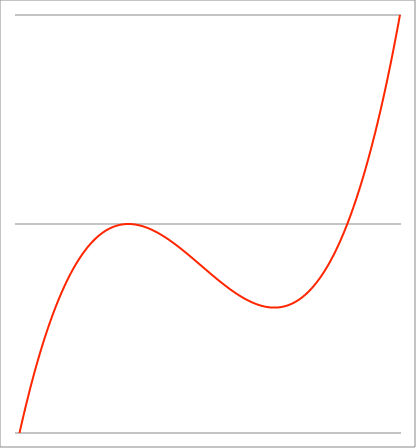
| Category | Series 1 |
|---|---|
| -3.54 | -1.077 |
| -3.537355 | -1.072 |
| -3.53471 | -1.068 |
| -3.532065000000001 | -1.064 |
| -3.529420000000001 | -1.059 |
| -3.526775000000001 | -1.055 |
| -3.524130000000001 | -1.051 |
| -3.521485000000002 | -1.047 |
| -3.518840000000002 | -1.042 |
| -3.516195000000002 | -1.038 |
| -3.513550000000002 | -1.034 |
| -3.510905000000002 | -1.03 |
| -3.508260000000003 | -1.026 |
| -3.505615000000003 | -1.021 |
| -3.502970000000003 | -1.017 |
| -3.500325000000003 | -1.013 |
| -3.497680000000003 | -1.009 |
| -3.495035000000004 | -1.005 |
| -3.492390000000004 | -1.001 |
| -3.489745000000004 | -0.996 |
| -3.487100000000004 | -0.992 |
| -3.484455000000004 | -0.988 |
| -3.481810000000005 | -0.984 |
| -3.479165000000005 | -0.98 |
| -3.476520000000005 | -0.976 |
| -3.473875000000005 | -0.972 |
| -3.471230000000006 | -0.968 |
| -3.468585000000006 | -0.964 |
| -3.465940000000006 | -0.96 |
| -3.463295000000006 | -0.956 |
| -3.460650000000006 | -0.952 |
| -3.458005000000007 | -0.948 |
| -3.455360000000007 | -0.944 |
| -3.452715000000007 | -0.94 |
| -3.450070000000007 | -0.936 |
| -3.447425000000007 | -0.932 |
| -3.444780000000008 | -0.928 |
| -3.442135000000008 | -0.924 |
| -3.439490000000008 | -0.92 |
| -3.436845000000008 | -0.916 |
| -3.434200000000009 | -0.912 |
| -3.431555000000009 | -0.908 |
| -3.428910000000009 | -0.904 |
| -3.426265000000009 | -0.9 |
| -3.423620000000009 | -0.897 |
| -3.42097500000001 | -0.893 |
| -3.41833000000001 | -0.889 |
| -3.41568500000001 | -0.885 |
| -3.41304000000001 | -0.881 |
| -3.41039500000001 | -0.877 |
| -3.407750000000011 | -0.874 |
| -3.405105000000011 | -0.87 |
| -3.402460000000011 | -0.866 |
| -3.399815000000011 | -0.862 |
| -3.397170000000011 | -0.858 |
| -3.394525000000012 | -0.855 |
| -3.391880000000012 | -0.851 |
| -3.389235000000012 | -0.847 |
| -3.386590000000012 | -0.843 |
| -3.383945000000013 | -0.84 |
| -3.381300000000013 | -0.836 |
| -3.378655000000013 | -0.832 |
| -3.376010000000013 | -0.829 |
| -3.373365000000013 | -0.825 |
| -3.370720000000014 | -0.821 |
| -3.368075000000014 | -0.818 |
| -3.365430000000014 | -0.814 |
| -3.362785000000014 | -0.81 |
| -3.360140000000015 | -0.807 |
| -3.357495000000015 | -0.803 |
| -3.354850000000015 | -0.799 |
| -3.352205000000015 | -0.796 |
| -3.349560000000015 | -0.792 |
| -3.346915000000016 | -0.789 |
| -3.344270000000016 | -0.785 |
| -3.341625000000016 | -0.781 |
| -3.338980000000016 | -0.778 |
| -3.336335000000016 | -0.774 |
| -3.333690000000017 | -0.771 |
| -3.331045000000017 | -0.767 |
| -3.328400000000017 | -0.764 |
| -3.325755000000017 | -0.76 |
| -3.323110000000017 | -0.757 |
| -3.320465000000018 | -0.753 |
| -3.317820000000018 | -0.75 |
| -3.315175000000018 | -0.746 |
| -3.312530000000018 | -0.743 |
| -3.309885000000019 | -0.739 |
| -3.307240000000019 | -0.736 |
| -3.304595000000019 | -0.733 |
| -3.301950000000019 | -0.729 |
| -3.299305000000019 | -0.726 |
| -3.29666000000002 | -0.722 |
| -3.29401500000002 | -0.719 |
| -3.29137000000002 | -0.716 |
| -3.28872500000002 | -0.712 |
| -3.286080000000021 | -0.709 |
| -3.283435000000021 | -0.706 |
| -3.280790000000021 | -0.702 |
| -3.278145000000021 | -0.699 |
| -3.275500000000021 | -0.696 |
| -3.272855000000022 | -0.692 |
| -3.270210000000022 | -0.689 |
| -3.267565000000022 | -0.686 |
| -3.264920000000022 | -0.682 |
| -3.262275000000022 | -0.679 |
| -3.259630000000023 | -0.676 |
| -3.256985000000023 | -0.673 |
| -3.254340000000023 | -0.669 |
| -3.251695000000023 | -0.666 |
| -3.249050000000024 | -0.663 |
| -3.246405000000024 | -0.66 |
| -3.243760000000024 | -0.656 |
| -3.241115000000024 | -0.653 |
| -3.238470000000024 | -0.65 |
| -3.235825000000025 | -0.647 |
| -3.233180000000025 | -0.644 |
| -3.230535000000025 | -0.641 |
| -3.227890000000025 | -0.637 |
| -3.225245000000025 | -0.634 |
| -3.222600000000026 | -0.631 |
| -3.219955000000026 | -0.628 |
| -3.217310000000026 | -0.625 |
| -3.214665000000026 | -0.622 |
| -3.212020000000027 | -0.619 |
| -3.209375000000027 | -0.616 |
| -3.206730000000027 | -0.613 |
| -3.204085000000027 | -0.61 |
| -3.201440000000027 | -0.606 |
| -3.198795000000028 | -0.603 |
| -3.196150000000028 | -0.6 |
| -3.193505000000028 | -0.597 |
| -3.190860000000028 | -0.594 |
| -3.188215000000028 | -0.591 |
| -3.185570000000029 | -0.588 |
| -3.182925000000029 | -0.585 |
| -3.18028000000003 | -0.582 |
| -3.177635000000029 | -0.579 |
| -3.174990000000029 | -0.576 |
| -3.17234500000003 | -0.573 |
| -3.16970000000003 | -0.57 |
| -3.16705500000003 | -0.568 |
| -3.16441000000003 | -0.565 |
| -3.161765000000031 | -0.562 |
| -3.159120000000031 | -0.559 |
| -3.156475000000031 | -0.556 |
| -3.153830000000031 | -0.553 |
| -3.151185000000031 | -0.55 |
| -3.148540000000032 | -0.547 |
| -3.145895000000032 | -0.544 |
| -3.143250000000032 | -0.542 |
| -3.140605000000032 | -0.539 |
| -3.137960000000032 | -0.536 |
| -3.135315000000033 | -0.533 |
| -3.132670000000033 | -0.53 |
| -3.130025000000033 | -0.527 |
| -3.127380000000033 | -0.525 |
| -3.124735000000033 | -0.522 |
| -3.122090000000034 | -0.519 |
| -3.119445000000034 | -0.516 |
| -3.116800000000034 | -0.513 |
| -3.114155000000034 | -0.511 |
| -3.111510000000035 | -0.508 |
| -3.108865000000035 | -0.505 |
| -3.106220000000035 | -0.502 |
| -3.103575000000035 | -0.5 |
| -3.100930000000035 | -0.497 |
| -3.098285000000036 | -0.494 |
| -3.095640000000036 | -0.492 |
| -3.092995000000036 | -0.489 |
| -3.090350000000036 | -0.486 |
| -3.087705000000036 | -0.484 |
| -3.085060000000037 | -0.481 |
| -3.082415000000037 | -0.478 |
| -3.079770000000037 | -0.476 |
| -3.077125000000037 | -0.473 |
| -3.074480000000038 | -0.47 |
| -3.071835000000038 | -0.468 |
| -3.069190000000038 | -0.465 |
| -3.066545000000038 | -0.463 |
| -3.063900000000038 | -0.46 |
| -3.061255000000039 | -0.457 |
| -3.058610000000039 | -0.455 |
| -3.055965000000039 | -0.452 |
| -3.05332000000004 | -0.45 |
| -3.05067500000004 | -0.447 |
| -3.04803000000004 | -0.445 |
| -3.04538500000004 | -0.442 |
| -3.04274000000004 | -0.44 |
| -3.04009500000004 | -0.437 |
| -3.037450000000041 | -0.435 |
| -3.034805000000041 | -0.432 |
| -3.032160000000041 | -0.43 |
| -3.029515000000041 | -0.427 |
| -3.026870000000041 | -0.425 |
| -3.024225000000042 | -0.422 |
| -3.021580000000042 | -0.42 |
| -3.018935000000042 | -0.417 |
| -3.016290000000042 | -0.415 |
| -3.013645000000043 | -0.412 |
| -3.011000000000043 | -0.41 |
| -3.008355000000043 | -0.408 |
| -3.005710000000043 | -0.405 |
| -3.003065000000043 | -0.403 |
| -3.000420000000044 | -0.4 |
| -2.997775000000044 | -0.398 |
| -2.995130000000044 | -0.396 |
| -2.992485000000044 | -0.393 |
| -2.989840000000044 | -0.391 |
| -2.987195000000045 | -0.389 |
| -2.984550000000045 | -0.386 |
| -2.981905000000045 | -0.384 |
| -2.979260000000045 | -0.382 |
| -2.976615000000045 | -0.379 |
| -2.973970000000046 | -0.377 |
| -2.971325000000046 | -0.375 |
| -2.968680000000046 | -0.372 |
| -2.966035000000046 | -0.37 |
| -2.963390000000046 | -0.368 |
| -2.960745000000047 | -0.366 |
| -2.958100000000047 | -0.363 |
| -2.955455000000047 | -0.361 |
| -2.952810000000047 | -0.359 |
| -2.950165000000048 | -0.357 |
| -2.947520000000048 | -0.354 |
| -2.944875000000048 | -0.352 |
| -2.942230000000048 | -0.35 |
| -2.939585000000048 | -0.348 |
| -2.936940000000049 | -0.346 |
| -2.934295000000049 | -0.343 |
| -2.931650000000049 | -0.341 |
| -2.929005000000049 | -0.339 |
| -2.92636000000005 | -0.337 |
| -2.92371500000005 | -0.335 |
| -2.92107000000005 | -0.333 |
| -2.91842500000005 | -0.331 |
| -2.91578000000005 | -0.328 |
| -2.913135000000051 | -0.326 |
| -2.910490000000051 | -0.324 |
| -2.907845000000051 | -0.322 |
| -2.905200000000051 | -0.32 |
| -2.902555000000051 | -0.318 |
| -2.899910000000052 | -0.316 |
| -2.897265000000052 | -0.314 |
| -2.894620000000052 | -0.312 |
| -2.891975000000052 | -0.31 |
| -2.889330000000052 | -0.308 |
| -2.886685000000053 | -0.306 |
| -2.884040000000053 | -0.304 |
| -2.881395000000053 | -0.302 |
| -2.878750000000053 | -0.3 |
| -2.876105000000054 | -0.298 |
| -2.873460000000054 | -0.296 |
| -2.870815000000054 | -0.294 |
| -2.868170000000054 | -0.292 |
| -2.865525000000054 | -0.29 |
| -2.862880000000055 | -0.288 |
| -2.860235000000055 | -0.286 |
| -2.857590000000055 | -0.284 |
| -2.854945000000055 | -0.282 |
| -2.852300000000056 | -0.28 |
| -2.849655000000056 | -0.278 |
| -2.847010000000056 | -0.276 |
| -2.844365000000056 | -0.274 |
| -2.841720000000056 | -0.272 |
| -2.839075000000057 | -0.27 |
| -2.836430000000057 | -0.268 |
| -2.833785000000057 | -0.267 |
| -2.831140000000057 | -0.265 |
| -2.828495000000057 | -0.263 |
| -2.825850000000058 | -0.261 |
| -2.823205000000058 | -0.259 |
| -2.820560000000058 | -0.257 |
| -2.817915000000058 | -0.255 |
| -2.815270000000059 | -0.254 |
| -2.812625000000059 | -0.252 |
| -2.809980000000059 | -0.25 |
| -2.80733500000006 | -0.248 |
| -2.804690000000059 | -0.246 |
| -2.80204500000006 | -0.245 |
| -2.79940000000006 | -0.243 |
| -2.79675500000006 | -0.241 |
| -2.79411000000006 | -0.239 |
| -2.79146500000006 | -0.238 |
| -2.788820000000061 | -0.236 |
| -2.786175000000061 | -0.234 |
| -2.783530000000061 | -0.232 |
| -2.780885000000061 | -0.231 |
| -2.778240000000061 | -0.229 |
| -2.775595000000062 | -0.227 |
| -2.772950000000062 | -0.225 |
| -2.770305000000062 | -0.224 |
| -2.767660000000062 | -0.222 |
| -2.765015000000063 | -0.22 |
| -2.762370000000063 | -0.219 |
| -2.759725000000063 | -0.217 |
| -2.757080000000063 | -0.215 |
| -2.754435000000063 | -0.214 |
| -2.751790000000064 | -0.212 |
| -2.749145000000064 | -0.21 |
| -2.746500000000064 | -0.209 |
| -2.743855000000064 | -0.207 |
| -2.741210000000064 | -0.206 |
| -2.738565000000065 | -0.204 |
| -2.735920000000065 | -0.202 |
| -2.733275000000065 | -0.201 |
| -2.730630000000065 | -0.199 |
| -2.727985000000066 | -0.198 |
| -2.725340000000066 | -0.196 |
| -2.722695000000066 | -0.194 |
| -2.720050000000066 | -0.193 |
| -2.717405000000066 | -0.191 |
| -2.714760000000067 | -0.19 |
| -2.712115000000067 | -0.188 |
| -2.709470000000067 | -0.187 |
| -2.706825000000067 | -0.185 |
| -2.704180000000067 | -0.184 |
| -2.701535000000068 | -0.182 |
| -2.698890000000068 | -0.181 |
| -2.696245000000068 | -0.179 |
| -2.693600000000068 | -0.178 |
| -2.690955000000068 | -0.176 |
| -2.688310000000069 | -0.175 |
| -2.685665000000069 | -0.173 |
| -2.68302000000007 | -0.172 |
| -2.680375000000069 | -0.17 |
| -2.67773000000007 | -0.169 |
| -2.67508500000007 | -0.167 |
| -2.67244000000007 | -0.166 |
| -2.66979500000007 | -0.165 |
| -2.66715000000007 | -0.163 |
| -2.664505000000071 | -0.162 |
| -2.661860000000071 | -0.16 |
| -2.659215000000071 | -0.159 |
| -2.656570000000071 | -0.158 |
| -2.653925000000071 | -0.156 |
| -2.651280000000072 | -0.155 |
| -2.648635000000072 | -0.154 |
| -2.645990000000072 | -0.152 |
| -2.643345000000072 | -0.151 |
| -2.640700000000072 | -0.149 |
| -2.638055000000073 | -0.148 |
| -2.635410000000073 | -0.147 |
| -2.632765000000073 | -0.145 |
| -2.630120000000073 | -0.144 |
| -2.627475000000074 | -0.143 |
| -2.624830000000074 | -0.142 |
| -2.622185000000074 | -0.14 |
| -2.619540000000074 | -0.139 |
| -2.616895000000074 | -0.138 |
| -2.614250000000075 | -0.136 |
| -2.611605000000075 | -0.135 |
| -2.608960000000075 | -0.134 |
| -2.606315000000075 | -0.133 |
| -2.603670000000076 | -0.131 |
| -2.601025000000076 | -0.13 |
| -2.598380000000076 | -0.129 |
| -2.595735000000076 | -0.128 |
| -2.593090000000076 | -0.126 |
| -2.590445000000077 | -0.125 |
| -2.587800000000077 | -0.124 |
| -2.585155000000077 | -0.123 |
| -2.582510000000077 | -0.122 |
| -2.579865000000078 | -0.12 |
| -2.577220000000078 | -0.119 |
| -2.574575000000078 | -0.118 |
| -2.571930000000078 | -0.117 |
| -2.569285000000078 | -0.116 |
| -2.566640000000079 | -0.115 |
| -2.563995000000079 | -0.113 |
| -2.56135000000008 | -0.112 |
| -2.558705000000079 | -0.111 |
| -2.556060000000079 | -0.11 |
| -2.55341500000008 | -0.109 |
| -2.55077000000008 | -0.108 |
| -2.54812500000008 | -0.107 |
| -2.54548000000008 | -0.105 |
| -2.542835000000081 | -0.104 |
| -2.540190000000081 | -0.103 |
| -2.537545000000081 | -0.102 |
| -2.534900000000081 | -0.101 |
| -2.532255000000081 | -0.1 |
| -2.529610000000082 | -0.099 |
| -2.526965000000082 | -0.098 |
| -2.524320000000082 | -0.097 |
| -2.521675000000082 | -0.096 |
| -2.519030000000082 | -0.095 |
| -2.516385000000083 | -0.094 |
| -2.513740000000083 | -0.093 |
| -2.511095000000083 | -0.092 |
| -2.508450000000083 | -0.091 |
| -2.505805000000084 | -0.09 |
| -2.503160000000084 | -0.089 |
| -2.500515000000084 | -0.088 |
| -2.497870000000084 | -0.087 |
| -2.495225000000084 | -0.086 |
| -2.492580000000085 | -0.085 |
| -2.489935000000085 | -0.084 |
| -2.487290000000085 | -0.083 |
| -2.484645000000085 | -0.082 |
| -2.482000000000085 | -0.081 |
| -2.479355000000086 | -0.08 |
| -2.476710000000086 | -0.079 |
| -2.474065000000086 | -0.078 |
| -2.471420000000086 | -0.077 |
| -2.468775000000087 | -0.076 |
| -2.466130000000087 | -0.075 |
| -2.463485000000087 | -0.074 |
| -2.460840000000087 | -0.073 |
| -2.458195000000087 | -0.073 |
| -2.455550000000088 | -0.072 |
| -2.452905000000088 | -0.071 |
| -2.450260000000088 | -0.07 |
| -2.447615000000088 | -0.069 |
| -2.444970000000088 | -0.068 |
| -2.442325000000089 | -0.067 |
| -2.439680000000089 | -0.066 |
| -2.437035000000089 | -0.066 |
| -2.434390000000089 | -0.065 |
| -2.43174500000009 | -0.064 |
| -2.42910000000009 | -0.063 |
| -2.42645500000009 | -0.062 |
| -2.42381000000009 | -0.061 |
| -2.42116500000009 | -0.061 |
| -2.418520000000091 | -0.06 |
| -2.415875000000091 | -0.059 |
| -2.413230000000091 | -0.058 |
| -2.410585000000091 | -0.057 |
| -2.407940000000091 | -0.057 |
| -2.405295000000092 | -0.056 |
| -2.402650000000092 | -0.055 |
| -2.400005000000092 | -0.054 |
| -2.397360000000092 | -0.054 |
| -2.394715000000092 | -0.053 |
| -2.392070000000093 | -0.052 |
| -2.389425000000093 | -0.051 |
| -2.386780000000093 | -0.051 |
| -2.384135000000093 | -0.05 |
| -2.381490000000094 | -0.049 |
| -2.378845000000094 | -0.048 |
| -2.376200000000094 | -0.048 |
| -2.373555000000094 | -0.047 |
| -2.370910000000094 | -0.046 |
| -2.368265000000095 | -0.046 |
| -2.365620000000095 | -0.045 |
| -2.362975000000095 | -0.044 |
| -2.360330000000095 | -0.044 |
| -2.357685000000095 | -0.043 |
| -2.355040000000096 | -0.042 |
| -2.352395000000096 | -0.042 |
| -2.349750000000096 | -0.041 |
| -2.347105000000096 | -0.04 |
| -2.344460000000097 | -0.04 |
| -2.341815000000097 | -0.039 |
| -2.339170000000097 | -0.038 |
| -2.336525000000097 | -0.038 |
| -2.333880000000097 | -0.037 |
| -2.331235000000098 | -0.037 |
| -2.328590000000098 | -0.036 |
| -2.325945000000098 | -0.035 |
| -2.323300000000098 | -0.035 |
| -2.320655000000098 | -0.034 |
| -2.318010000000099 | -0.034 |
| -2.315365000000099 | -0.033 |
| -2.312720000000099 | -0.032 |
| -2.310075000000099 | -0.032 |
| -2.3074300000001 | -0.031 |
| -2.3047850000001 | -0.031 |
| -2.3021400000001 | -0.03 |
| -2.2994950000001 | -0.03 |
| -2.2968500000001 | -0.029 |
| -2.294205000000101 | -0.029 |
| -2.291560000000101 | -0.028 |
| -2.288915000000101 | -0.027 |
| -2.286270000000101 | -0.027 |
| -2.283625000000101 | -0.026 |
| -2.280980000000102 | -0.026 |
| -2.278335000000102 | -0.025 |
| -2.275690000000102 | -0.025 |
| -2.273045000000102 | -0.024 |
| -2.270400000000103 | -0.024 |
| -2.267755000000103 | -0.023 |
| -2.265110000000103 | -0.023 |
| -2.262465000000103 | -0.022 |
| -2.259820000000103 | -0.022 |
| -2.257175000000104 | -0.022 |
| -2.254530000000104 | -0.021 |
| -2.251885000000104 | -0.021 |
| -2.249240000000104 | -0.02 |
| -2.246595000000104 | -0.02 |
| -2.243950000000105 | -0.019 |
| -2.241305000000105 | -0.019 |
| -2.238660000000105 | -0.018 |
| -2.236015000000105 | -0.018 |
| -2.233370000000106 | -0.018 |
| -2.230725000000106 | -0.017 |
| -2.228080000000106 | -0.017 |
| -2.225435000000106 | -0.016 |
| -2.222790000000106 | -0.016 |
| -2.220145000000107 | -0.016 |
| -2.217500000000107 | -0.015 |
| -2.214855000000107 | -0.015 |
| -2.212210000000107 | -0.014 |
| -2.209565000000107 | -0.014 |
| -2.206920000000108 | -0.014 |
| -2.204275000000108 | -0.013 |
| -2.201630000000108 | -0.013 |
| -2.198985000000108 | -0.013 |
| -2.196340000000109 | -0.012 |
| -2.193695000000109 | -0.012 |
| -2.191050000000109 | -0.012 |
| -2.188405000000109 | -0.011 |
| -2.185760000000109 | -0.011 |
| -2.18311500000011 | -0.011 |
| -2.18047000000011 | -0.01 |
| -2.17782500000011 | -0.01 |
| -2.17518000000011 | -0.01 |
| -2.17253500000011 | -0.009 |
| -2.169890000000111 | -0.009 |
| -2.167245000000111 | -0.009 |
| -2.164600000000111 | -0.009 |
| -2.161955000000111 | -0.008 |
| -2.159310000000112 | -0.008 |
| -2.156665000000112 | -0.008 |
| -2.154020000000112 | -0.007 |
| -2.151375000000112 | -0.007 |
| -2.148730000000112 | -0.007 |
| -2.146085000000113 | -0.007 |
| -2.143440000000113 | -0.006 |
| -2.140795000000113 | -0.006 |
| -2.138150000000113 | -0.006 |
| -2.135505000000113 | -0.006 |
| -2.132860000000114 | -0.006 |
| -2.130215000000114 | -0.005 |
| -2.127570000000114 | -0.005 |
| -2.124925000000114 | -0.005 |
| -2.122280000000115 | -0.005 |
| -2.119635000000115 | -0.004 |
| -2.116990000000115 | -0.004 |
| -2.114345000000115 | -0.004 |
| -2.111700000000115 | -0.004 |
| -2.109055000000116 | -0.004 |
| -2.106410000000116 | -0.004 |
| -2.103765000000116 | -0.003 |
| -2.101120000000116 | -0.003 |
| -2.098475000000116 | -0.003 |
| -2.095830000000117 | -0.003 |
| -2.093185000000117 | -0.003 |
| -2.090540000000117 | -0.003 |
| -2.087895000000117 | -0.002 |
| -2.085250000000117 | -0.002 |
| -2.082605000000118 | -0.002 |
| -2.079960000000118 | -0.002 |
| -2.077315000000118 | -0.002 |
| -2.074670000000118 | -0.002 |
| -2.072025000000119 | -0.002 |
| -2.069380000000119 | -0.001 |
| -2.066735000000119 | -0.001 |
| -2.06409000000012 | -0.001 |
| -2.061445000000119 | -0.001 |
| -2.05880000000012 | -0.001 |
| -2.05615500000012 | -0.001 |
| -2.05351000000012 | -0.001 |
| -2.05086500000012 | -0.001 |
| -2.04822000000012 | -0.001 |
| -2.045575000000121 | -0.001 |
| -2.042930000000121 | -0.001 |
| -2.040285000000121 | 0 |
| -2.037640000000121 | 0 |
| -2.034995000000122 | 0 |
| -2.032350000000122 | 0 |
| -2.029705000000122 | 0 |
| -2.027060000000122 | 0 |
| -2.024415000000122 | 0 |
| -2.021770000000123 | 0 |
| -2.019125000000123 | 0 |
| -2.016480000000123 | 0 |
| -2.013835000000123 | 0 |
| -2.011190000000123 | 0 |
| -2.008545000000124 | 0 |
| -2.005900000000124 | 0 |
| -2.003255000000124 | 0 |
| -2.000610000000124 | 0 |
| -1.997965000000124 | 0 |
| -1.995320000000124 | 0 |
| -1.992675000000124 | 0 |
| -1.990030000000124 | 0 |
| -1.987385000000124 | 0 |
| -1.984740000000124 | 0 |
| -1.982095000000124 | 0 |
| -1.979450000000124 | 0 |
| -1.976805000000124 | 0 |
| -1.974160000000124 | 0 |
| -1.971515000000124 | 0 |
| -1.968870000000124 | 0 |
| -1.966225000000124 | 0 |
| -1.963580000000124 | 0 |
| -1.960935000000124 | 0 |
| -1.958290000000124 | -0.001 |
| -1.955645000000124 | -0.001 |
| -1.953000000000124 | -0.001 |
| -1.950355000000124 | -0.001 |
| -1.947710000000124 | -0.001 |
| -1.945065000000124 | -0.001 |
| -1.942420000000124 | -0.001 |
| -1.939775000000124 | -0.001 |
| -1.937130000000124 | -0.001 |
| -1.934485000000124 | -0.001 |
| -1.931840000000124 | -0.001 |
| -1.929195000000124 | -0.001 |
| -1.926550000000124 | -0.002 |
| -1.923905000000124 | -0.002 |
| -1.921260000000124 | -0.002 |
| -1.918615000000124 | -0.002 |
| -1.915970000000124 | -0.002 |
| -1.913325000000124 | -0.002 |
| -1.910680000000124 | -0.002 |
| -1.908035000000124 | -0.002 |
| -1.905390000000124 | -0.003 |
| -1.902745000000124 | -0.003 |
| -1.900100000000124 | -0.003 |
| -1.897455000000124 | -0.003 |
| -1.894810000000124 | -0.003 |
| -1.892165000000124 | -0.003 |
| -1.889520000000124 | -0.004 |
| -1.886875000000124 | -0.004 |
| -1.884230000000124 | -0.004 |
| -1.881585000000124 | -0.004 |
| -1.878940000000124 | -0.004 |
| -1.876295000000124 | -0.004 |
| -1.873650000000124 | -0.005 |
| -1.871005000000124 | -0.005 |
| -1.868360000000124 | -0.005 |
| -1.865715000000124 | -0.005 |
| -1.863070000000124 | -0.005 |
| -1.860425000000124 | -0.006 |
| -1.857780000000124 | -0.006 |
| -1.855135000000124 | -0.006 |
| -1.852490000000124 | -0.006 |
| -1.849845000000124 | -0.006 |
| -1.847200000000124 | -0.007 |
| -1.844555000000124 | -0.007 |
| -1.841910000000124 | -0.007 |
| -1.839265000000124 | -0.007 |
| -1.836620000000124 | -0.008 |
| -1.833975000000124 | -0.008 |
| -1.831330000000124 | -0.008 |
| -1.828685000000124 | -0.008 |
| -1.826040000000124 | -0.009 |
| -1.823395000000124 | -0.009 |
| -1.820750000000124 | -0.009 |
| -1.818105000000124 | -0.009 |
| -1.815460000000124 | -0.01 |
| -1.812815000000124 | -0.01 |
| -1.810170000000124 | -0.01 |
| -1.807525000000124 | -0.01 |
| -1.804880000000124 | -0.011 |
| -1.802235000000124 | -0.011 |
| -1.799590000000124 | -0.011 |
| -1.796945000000124 | -0.012 |
| -1.794300000000124 | -0.012 |
| -1.791655000000124 | -0.012 |
| -1.789010000000124 | -0.012 |
| -1.786365000000124 | -0.013 |
| -1.783720000000124 | -0.013 |
| -1.781075000000124 | -0.013 |
| -1.778430000000124 | -0.014 |
| -1.775785000000124 | -0.014 |
| -1.773140000000124 | -0.014 |
| -1.770495000000124 | -0.015 |
| -1.767850000000124 | -0.015 |
| -1.765205000000124 | -0.015 |
| -1.762560000000124 | -0.016 |
| -1.759915000000123 | -0.016 |
| -1.757270000000123 | -0.016 |
| -1.754625000000123 | -0.017 |
| -1.751980000000123 | -0.017 |
| -1.749335000000123 | -0.017 |
| -1.746690000000123 | -0.018 |
| -1.744045000000123 | -0.018 |
| -1.741400000000123 | -0.018 |
| -1.738755000000123 | -0.019 |
| -1.736110000000123 | -0.019 |
| -1.733465000000123 | -0.019 |
| -1.730820000000123 | -0.02 |
| -1.728175000000123 | -0.02 |
| -1.725530000000123 | -0.021 |
| -1.722885000000123 | -0.021 |
| -1.720240000000123 | -0.021 |
| -1.717595000000123 | -0.022 |
| -1.714950000000123 | -0.022 |
| -1.712305000000123 | -0.022 |
| -1.709660000000123 | -0.023 |
| -1.707015000000123 | -0.023 |
| -1.704370000000123 | -0.024 |
| -1.701725000000123 | -0.024 |
| -1.699080000000123 | -0.024 |
| -1.696435000000123 | -0.025 |
| -1.693790000000123 | -0.025 |
| -1.691145000000123 | -0.026 |
| -1.688500000000123 | -0.026 |
| -1.685855000000123 | -0.027 |
| -1.683210000000123 | -0.027 |
| -1.680565000000123 | -0.027 |
| -1.677920000000123 | -0.028 |
| -1.675275000000123 | -0.028 |
| -1.672630000000123 | -0.029 |
| -1.669985000000123 | -0.029 |
| -1.667340000000123 | -0.03 |
| -1.664695000000123 | -0.03 |
| -1.662050000000123 | -0.03 |
| -1.659405000000123 | -0.031 |
| -1.656760000000123 | -0.031 |
| -1.654115000000123 | -0.032 |
| -1.651470000000123 | -0.032 |
| -1.648825000000123 | -0.033 |
| -1.646180000000123 | -0.033 |
| -1.643535000000123 | -0.034 |
| -1.640890000000123 | -0.034 |
| -1.638245000000123 | -0.035 |
| -1.635600000000123 | -0.035 |
| -1.632955000000123 | -0.035 |
| -1.630310000000123 | -0.036 |
| -1.627665000000123 | -0.036 |
| -1.625020000000123 | -0.037 |
| -1.622375000000123 | -0.037 |
| -1.619730000000123 | -0.038 |
| -1.617085000000123 | -0.038 |
| -1.614440000000123 | -0.039 |
| -1.611795000000123 | -0.039 |
| -1.609150000000123 | -0.04 |
| -1.606505000000123 | -0.04 |
| -1.603860000000123 | -0.041 |
| -1.601215000000123 | -0.041 |
| -1.598570000000123 | -0.042 |
| -1.595925000000123 | -0.042 |
| -1.593280000000123 | -0.043 |
| -1.590635000000123 | -0.043 |
| -1.587990000000123 | -0.044 |
| -1.585345000000123 | -0.044 |
| -1.582700000000123 | -0.045 |
| -1.580055000000123 | -0.046 |
| -1.577410000000123 | -0.046 |
| -1.574765000000123 | -0.047 |
| -1.572120000000123 | -0.047 |
| -1.569475000000123 | -0.048 |
| -1.566830000000123 | -0.048 |
| -1.564185000000123 | -0.049 |
| -1.561540000000123 | -0.049 |
| -1.558895000000123 | -0.05 |
| -1.556250000000123 | -0.05 |
| -1.553605000000123 | -0.051 |
| -1.550960000000123 | -0.051 |
| -1.548315000000123 | -0.052 |
| -1.545670000000123 | -0.053 |
| -1.543025000000123 | -0.053 |
| -1.540380000000123 | -0.054 |
| -1.537735000000123 | -0.054 |
| -1.535090000000123 | -0.055 |
| -1.532445000000123 | -0.055 |
| -1.529800000000123 | -0.056 |
| -1.527155000000123 | -0.057 |
| -1.524510000000123 | -0.057 |
| -1.521865000000123 | -0.058 |
| -1.519220000000123 | -0.058 |
| -1.516575000000123 | -0.059 |
| -1.513930000000123 | -0.059 |
| -1.511285000000123 | -0.06 |
| -1.508640000000123 | -0.061 |
| -1.505995000000123 | -0.061 |
| -1.503350000000123 | -0.062 |
| -1.500705000000123 | -0.062 |
| -1.498060000000123 | -0.063 |
| -1.495415000000123 | -0.064 |
| -1.492770000000123 | -0.064 |
| -1.490125000000123 | -0.065 |
| -1.487480000000123 | -0.065 |
| -1.484835000000123 | -0.066 |
| -1.482190000000123 | -0.067 |
| -1.479545000000123 | -0.067 |
| -1.476900000000123 | -0.068 |
| -1.474255000000123 | -0.068 |
| -1.471610000000123 | -0.069 |
| -1.468965000000123 | -0.07 |
| -1.466320000000123 | -0.07 |
| -1.463675000000123 | -0.071 |
| -1.461030000000123 | -0.071 |
| -1.458385000000123 | -0.072 |
| -1.455740000000123 | -0.073 |
| -1.453095000000123 | -0.073 |
| -1.450450000000123 | -0.074 |
| -1.447805000000123 | -0.075 |
| -1.445160000000123 | -0.075 |
| -1.442515000000123 | -0.076 |
| -1.439870000000123 | -0.077 |
| -1.437225000000123 | -0.077 |
| -1.434580000000123 | -0.078 |
| -1.431935000000122 | -0.078 |
| -1.429290000000122 | -0.079 |
| -1.426645000000122 | -0.08 |
| -1.424000000000122 | -0.08 |
| -1.421355000000122 | -0.081 |
| -1.418710000000122 | -0.082 |
| -1.416065000000122 | -0.082 |
| -1.413420000000122 | -0.083 |
| -1.410775000000122 | -0.084 |
| -1.408130000000122 | -0.084 |
| -1.405485000000122 | -0.085 |
| -1.402840000000122 | -0.086 |
| -1.400195000000122 | -0.086 |
| -1.397550000000122 | -0.087 |
| -1.394905000000122 | -0.088 |
| -1.392260000000122 | -0.088 |
| -1.389615000000122 | -0.089 |
| -1.386970000000122 | -0.09 |
| -1.384325000000122 | -0.09 |
| -1.381680000000122 | -0.091 |
| -1.379035000000122 | -0.092 |
| -1.376390000000122 | -0.092 |
| -1.373745000000122 | -0.093 |
| -1.371100000000122 | -0.094 |
| -1.368455000000122 | -0.094 |
| -1.365810000000122 | -0.095 |
| -1.363165000000122 | -0.096 |
| -1.360520000000122 | -0.097 |
| -1.357875000000122 | -0.097 |
| -1.355230000000122 | -0.098 |
| -1.352585000000122 | -0.099 |
| -1.349940000000122 | -0.099 |
| -1.347295000000122 | -0.1 |
| -1.344650000000122 | -0.101 |
| -1.342005000000122 | -0.101 |
| -1.339360000000122 | -0.102 |
| -1.336715000000122 | -0.103 |
| -1.334070000000122 | -0.104 |
| -1.331425000000122 | -0.104 |
| -1.328780000000122 | -0.105 |
| -1.326135000000122 | -0.106 |
| -1.323490000000122 | -0.106 |
| -1.320845000000122 | -0.107 |
| -1.318200000000122 | -0.108 |
| -1.315555000000122 | -0.108 |
| -1.312910000000122 | -0.109 |
| -1.310265000000122 | -0.11 |
| -1.307620000000122 | -0.111 |
| -1.304975000000122 | -0.111 |
| -1.302330000000122 | -0.112 |
| -1.299685000000122 | -0.113 |
| -1.297040000000122 | -0.114 |
| -1.294395000000122 | -0.114 |
| -1.291750000000122 | -0.115 |
| -1.289105000000122 | -0.116 |
| -1.286460000000122 | -0.116 |
| -1.283815000000122 | -0.117 |
| -1.281170000000122 | -0.118 |
| -1.278525000000122 | -0.119 |
| -1.275880000000122 | -0.119 |
| -1.273235000000122 | -0.12 |
| -1.270590000000122 | -0.121 |
| -1.267945000000122 | -0.122 |
| -1.265300000000122 | -0.122 |
| -1.262655000000122 | -0.123 |
| -1.260010000000122 | -0.124 |
| -1.257365000000122 | -0.124 |
| -1.254720000000122 | -0.125 |
| -1.252075000000122 | -0.126 |
| -1.249430000000122 | -0.127 |
| -1.246785000000122 | -0.127 |
| -1.244140000000122 | -0.128 |
| -1.241495000000122 | -0.129 |
| -1.238850000000122 | -0.13 |
| -1.236205000000122 | -0.13 |
| -1.233560000000122 | -0.131 |
| -1.230915000000122 | -0.132 |
| -1.228270000000122 | -0.133 |
| -1.225625000000122 | -0.133 |
| -1.222980000000122 | -0.134 |
| -1.220335000000122 | -0.135 |
| -1.217690000000122 | -0.136 |
| -1.215045000000122 | -0.136 |
| -1.212400000000122 | -0.137 |
| -1.209755000000122 | -0.138 |
| -1.207110000000122 | -0.139 |
| -1.204465000000122 | -0.14 |
| -1.201820000000122 | -0.14 |
| -1.199175000000122 | -0.141 |
| -1.196530000000122 | -0.142 |
| -1.193885000000122 | -0.143 |
| -1.191240000000122 | -0.143 |
| -1.188595000000122 | -0.144 |
| -1.185950000000122 | -0.145 |
| -1.183305000000122 | -0.146 |
| -1.180660000000122 | -0.146 |
| -1.178015000000122 | -0.147 |
| -1.175370000000122 | -0.148 |
| -1.172725000000122 | -0.149 |
| -1.170080000000122 | -0.149 |
| -1.167435000000122 | -0.15 |
| -1.164790000000122 | -0.151 |
| -1.162145000000122 | -0.152 |
| -1.159500000000122 | -0.153 |
| -1.156855000000122 | -0.153 |
| -1.154210000000122 | -0.154 |
| -1.151565000000122 | -0.155 |
| -1.148920000000122 | -0.156 |
| -1.146275000000122 | -0.156 |
| -1.143630000000122 | -0.157 |
| -1.140985000000122 | -0.158 |
| -1.138340000000122 | -0.159 |
| -1.135695000000122 | -0.16 |
| -1.133050000000122 | -0.16 |
| -1.130405000000122 | -0.161 |
| -1.127760000000122 | -0.162 |
| -1.125115000000122 | -0.163 |
| -1.122470000000122 | -0.163 |
| -1.119825000000122 | -0.164 |
| -1.117180000000122 | -0.165 |
| -1.114535000000122 | -0.166 |
| -1.111890000000121 | -0.167 |
| -1.109245000000121 | -0.167 |
| -1.106600000000121 | -0.168 |
| -1.103955000000121 | -0.169 |
| -1.101310000000121 | -0.17 |
| -1.098665000000121 | -0.17 |
| -1.096020000000121 | -0.171 |
| -1.093375000000121 | -0.172 |
| -1.090730000000121 | -0.173 |
| -1.088085000000121 | -0.174 |
| -1.085440000000121 | -0.174 |
| -1.082795000000121 | -0.175 |
| -1.080150000000121 | -0.176 |
| -1.077505000000121 | -0.177 |
| -1.074860000000121 | -0.178 |
| -1.072215000000121 | -0.178 |
| -1.069570000000121 | -0.179 |
| -1.066925000000121 | -0.18 |
| -1.064280000000121 | -0.181 |
| -1.061635000000121 | -0.182 |
| -1.058990000000121 | -0.182 |
| -1.056345000000121 | -0.183 |
| -1.053700000000121 | -0.184 |
| -1.051055000000121 | -0.185 |
| -1.048410000000121 | -0.185 |
| -1.045765000000121 | -0.186 |
| -1.043120000000121 | -0.187 |
| -1.040475000000121 | -0.188 |
| -1.037830000000121 | -0.189 |
| -1.035185000000121 | -0.189 |
| -1.032540000000121 | -0.19 |
| -1.029895000000121 | -0.191 |
| -1.027250000000121 | -0.192 |
| -1.024605000000121 | -0.193 |
| -1.021960000000121 | -0.193 |
| -1.019315000000121 | -0.194 |
| -1.016670000000121 | -0.195 |
| -1.014025000000121 | -0.196 |
| -1.011380000000121 | -0.197 |
| -1.008735000000121 | -0.197 |
| -1.006090000000121 | -0.198 |
| -1.003445000000121 | -0.199 |
| -1.000800000000121 | -0.2 |
| -0.998155000000121 | -0.201 |
| -0.995510000000121 | -0.201 |
| -0.992865000000121 | -0.202 |
| -0.990220000000121 | -0.203 |
| -0.987575000000121 | -0.204 |
| -0.984930000000121 | -0.205 |
| -0.982285000000121 | -0.205 |
| -0.979640000000121 | -0.206 |
| -0.976995000000121 | -0.207 |
| -0.974350000000121 | -0.208 |
| -0.971705000000121 | -0.208 |
| -0.969060000000121 | -0.209 |
| -0.966415000000121 | -0.21 |
| -0.963770000000121 | -0.211 |
| -0.961125000000121 | -0.212 |
| -0.958480000000121 | -0.212 |
| -0.955835000000121 | -0.213 |
| -0.953190000000121 | -0.214 |
| -0.950545000000121 | -0.215 |
| -0.947900000000121 | -0.216 |
| -0.945255000000121 | -0.216 |
| -0.942610000000121 | -0.217 |
| -0.939965000000121 | -0.218 |
| -0.937320000000121 | -0.219 |
| -0.934675000000121 | -0.22 |
| -0.932030000000121 | -0.22 |
| -0.929385000000121 | -0.221 |
| -0.926740000000121 | -0.222 |
| -0.924095000000121 | -0.223 |
| -0.921450000000121 | -0.224 |
| -0.918805000000121 | -0.224 |
| -0.916160000000121 | -0.225 |
| -0.913515000000121 | -0.226 |
| -0.910870000000121 | -0.227 |
| -0.908225000000121 | -0.227 |
| -0.905580000000121 | -0.228 |
| -0.902935000000121 | -0.229 |
| -0.900290000000121 | -0.23 |
| -0.897645000000121 | -0.231 |
| -0.895000000000121 | -0.231 |
| -0.892355000000121 | -0.232 |
| -0.889710000000121 | -0.233 |
| -0.887065000000121 | -0.234 |
| -0.884420000000121 | -0.235 |
| -0.881775000000121 | -0.235 |
| -0.879130000000121 | -0.236 |
| -0.876485000000121 | -0.237 |
| -0.873840000000121 | -0.238 |
| -0.871195000000121 | -0.238 |
| -0.868550000000121 | -0.239 |
| -0.865905000000121 | -0.24 |
| -0.863260000000121 | -0.241 |
| -0.860615000000121 | -0.242 |
| -0.857970000000121 | -0.242 |
| -0.855325000000121 | -0.243 |
| -0.852680000000121 | -0.244 |
| -0.850035000000121 | -0.245 |
| -0.847390000000121 | -0.245 |
| -0.844745000000121 | -0.246 |
| -0.842100000000121 | -0.247 |
| -0.839455000000121 | -0.248 |
| -0.836810000000121 | -0.249 |
| -0.834165000000121 | -0.249 |
| -0.831520000000121 | -0.25 |
| -0.828875000000121 | -0.251 |
| -0.826230000000121 | -0.252 |
| -0.823585000000121 | -0.252 |
| -0.820940000000121 | -0.253 |
| -0.818295000000121 | -0.254 |
| -0.815650000000121 | -0.255 |
| -0.813005000000121 | -0.255 |
| -0.81036000000012 | -0.256 |
| -0.80771500000012 | -0.257 |
| -0.80507000000012 | -0.258 |
| -0.80242500000012 | -0.259 |
| -0.79978000000012 | -0.259 |
| -0.79713500000012 | -0.26 |
| -0.79449000000012 | -0.261 |
| -0.79184500000012 | -0.262 |
| -0.78920000000012 | -0.262 |
| -0.78655500000012 | -0.263 |
| -0.78391000000012 | -0.264 |
| -0.78126500000012 | -0.265 |
| -0.77862000000012 | -0.265 |
| -0.77597500000012 | -0.266 |
| -0.77333000000012 | -0.267 |
| -0.77068500000012 | -0.268 |
| -0.76804000000012 | -0.268 |
| -0.76539500000012 | -0.269 |
| -0.76275000000012 | -0.27 |
| -0.76010500000012 | -0.271 |
| -0.75746000000012 | -0.271 |
| -0.75481500000012 | -0.272 |
| -0.75217000000012 | -0.273 |
| -0.74952500000012 | -0.274 |
| -0.74688000000012 | -0.274 |
| -0.74423500000012 | -0.275 |
| -0.74159000000012 | -0.276 |
| -0.73894500000012 | -0.277 |
| -0.73630000000012 | -0.277 |
| -0.73365500000012 | -0.278 |
| -0.73101000000012 | -0.279 |
| -0.72836500000012 | -0.279 |
| -0.72572000000012 | -0.28 |
| -0.72307500000012 | -0.281 |
| -0.72043000000012 | -0.282 |
| -0.71778500000012 | -0.282 |
| -0.71514000000012 | -0.283 |
| -0.71249500000012 | -0.284 |
| -0.70985000000012 | -0.285 |
| -0.70720500000012 | -0.285 |
| -0.70456000000012 | -0.286 |
| -0.70191500000012 | -0.287 |
| -0.69927000000012 | -0.287 |
| -0.69662500000012 | -0.288 |
| -0.69398000000012 | -0.289 |
| -0.69133500000012 | -0.29 |
| -0.68869000000012 | -0.29 |
| -0.68604500000012 | -0.291 |
| -0.68340000000012 | -0.292 |
| -0.68075500000012 | -0.293 |
| -0.67811000000012 | -0.293 |
| -0.67546500000012 | -0.294 |
| -0.67282000000012 | -0.295 |
| -0.67017500000012 | -0.295 |
| -0.66753000000012 | -0.296 |
| -0.66488500000012 | -0.297 |
| -0.66224000000012 | -0.297 |
| -0.65959500000012 | -0.298 |
| -0.65695000000012 | -0.299 |
| -0.65430500000012 | -0.3 |
| -0.65166000000012 | -0.3 |
| -0.64901500000012 | -0.301 |
| -0.64637000000012 | -0.302 |
| -0.64372500000012 | -0.302 |
| -0.64108000000012 | -0.303 |
| -0.63843500000012 | -0.304 |
| -0.63579000000012 | -0.304 |
| -0.63314500000012 | -0.305 |
| -0.63050000000012 | -0.306 |
| -0.62785500000012 | -0.306 |
| -0.62521000000012 | -0.307 |
| -0.62256500000012 | -0.308 |
| -0.61992000000012 | -0.309 |
| -0.61727500000012 | -0.309 |
| -0.61463000000012 | -0.31 |
| -0.61198500000012 | -0.311 |
| -0.60934000000012 | -0.311 |
| -0.60669500000012 | -0.312 |
| -0.60405000000012 | -0.313 |
| -0.60140500000012 | -0.313 |
| -0.59876000000012 | -0.314 |
| -0.59611500000012 | -0.315 |
| -0.59347000000012 | -0.315 |
| -0.59082500000012 | -0.316 |
| -0.58818000000012 | -0.317 |
| -0.58553500000012 | -0.317 |
| -0.58289000000012 | -0.318 |
| -0.58024500000012 | -0.319 |
| -0.57760000000012 | -0.319 |
| -0.57495500000012 | -0.32 |
| -0.57231000000012 | -0.32 |
| -0.56966500000012 | -0.321 |
| -0.56702000000012 | -0.322 |
| -0.56437500000012 | -0.322 |
| -0.56173000000012 | -0.323 |
| -0.55908500000012 | -0.324 |
| -0.55644000000012 | -0.324 |
| -0.55379500000012 | -0.325 |
| -0.55115000000012 | -0.326 |
| -0.54850500000012 | -0.326 |
| -0.54586000000012 | -0.327 |
| -0.54321500000012 | -0.328 |
| -0.54057000000012 | -0.328 |
| -0.53792500000012 | -0.329 |
| -0.53528000000012 | -0.329 |
| -0.53263500000012 | -0.33 |
| -0.52999000000012 | -0.331 |
| -0.52734500000012 | -0.331 |
| -0.52470000000012 | -0.332 |
| -0.52205500000012 | -0.332 |
| -0.51941000000012 | -0.333 |
| -0.51676500000012 | -0.334 |
| -0.51412000000012 | -0.334 |
| -0.51147500000012 | -0.335 |
| -0.50883000000012 | -0.336 |
| -0.50618500000012 | -0.336 |
| -0.50354000000012 | -0.337 |
| -0.50089500000012 | -0.337 |
| -0.498250000000119 | -0.338 |
| -0.495605000000119 | -0.338 |
| -0.492960000000119 | -0.339 |
| -0.490315000000119 | -0.34 |
| -0.487670000000119 | -0.34 |
| -0.485025000000119 | -0.341 |
| -0.482380000000119 | -0.341 |
| -0.479735000000119 | -0.342 |
| -0.477090000000119 | -0.343 |
| -0.474445000000119 | -0.343 |
| -0.471800000000119 | -0.344 |
| -0.469155000000119 | -0.344 |
| -0.466510000000119 | -0.345 |
| -0.463865000000119 | -0.345 |
| -0.461220000000119 | -0.346 |
| -0.458575000000119 | -0.347 |
| -0.455930000000119 | -0.347 |
| -0.453285000000119 | -0.348 |
| -0.450640000000119 | -0.348 |
| -0.447995000000119 | -0.349 |
| -0.445350000000119 | -0.349 |
| -0.442705000000119 | -0.35 |
| -0.440060000000119 | -0.35 |
| -0.437415000000119 | -0.351 |
| -0.434770000000119 | -0.352 |
| -0.432125000000119 | -0.352 |
| -0.429480000000119 | -0.353 |
| -0.426835000000119 | -0.353 |
| -0.424190000000119 | -0.354 |
| -0.421545000000119 | -0.354 |
| -0.418900000000119 | -0.355 |
| -0.416255000000119 | -0.355 |
| -0.413610000000119 | -0.356 |
| -0.410965000000119 | -0.356 |
| -0.408320000000119 | -0.357 |
| -0.405675000000119 | -0.357 |
| -0.403030000000119 | -0.358 |
| -0.400385000000119 | -0.358 |
| -0.397740000000119 | -0.359 |
| -0.395095000000119 | -0.359 |
| -0.392450000000119 | -0.36 |
| -0.389805000000119 | -0.36 |
| -0.387160000000119 | -0.361 |
| -0.384515000000119 | -0.361 |
| -0.381870000000119 | -0.362 |
| -0.379225000000119 | -0.362 |
| -0.376580000000119 | -0.363 |
| -0.373935000000119 | -0.363 |
| -0.371290000000119 | -0.364 |
| -0.368645000000119 | -0.364 |
| -0.366000000000119 | -0.365 |
| -0.363355000000119 | -0.365 |
| -0.360710000000119 | -0.366 |
| -0.358065000000119 | -0.366 |
| -0.355420000000119 | -0.367 |
| -0.352775000000119 | -0.367 |
| -0.350130000000119 | -0.368 |
| -0.347485000000119 | -0.368 |
| -0.344840000000119 | -0.368 |
| -0.342195000000119 | -0.369 |
| -0.339550000000119 | -0.369 |
| -0.336905000000119 | -0.37 |
| -0.334260000000119 | -0.37 |
| -0.331615000000119 | -0.371 |
| -0.328970000000119 | -0.371 |
| -0.326325000000119 | -0.372 |
| -0.323680000000119 | -0.372 |
| -0.321035000000119 | -0.372 |
| -0.318390000000119 | -0.373 |
| -0.315745000000119 | -0.373 |
| -0.313100000000119 | -0.374 |
| -0.310455000000119 | -0.374 |
| -0.307810000000119 | -0.374 |
| -0.305165000000119 | -0.375 |
| -0.302520000000119 | -0.375 |
| -0.299875000000119 | -0.376 |
| -0.297230000000119 | -0.376 |
| -0.294585000000119 | -0.377 |
| -0.291940000000119 | -0.377 |
| -0.289295000000119 | -0.377 |
| -0.286650000000119 | -0.378 |
| -0.284005000000119 | -0.378 |
| -0.281360000000119 | -0.378 |
| -0.278715000000119 | -0.379 |
| -0.276070000000119 | -0.379 |
| -0.273425000000119 | -0.38 |
| -0.270780000000119 | -0.38 |
| -0.268135000000119 | -0.38 |
| -0.265490000000119 | -0.381 |
| -0.262845000000119 | -0.381 |
| -0.260200000000119 | -0.381 |
| -0.257555000000119 | -0.382 |
| -0.254910000000119 | -0.382 |
| -0.252265000000119 | -0.383 |
| -0.249620000000119 | -0.383 |
| -0.246975000000119 | -0.383 |
| -0.244330000000119 | -0.384 |
| -0.241685000000119 | -0.384 |
| -0.239040000000119 | -0.384 |
| -0.236395000000119 | -0.385 |
| -0.233750000000119 | -0.385 |
| -0.231105000000119 | -0.385 |
| -0.228460000000119 | -0.386 |
| -0.225815000000119 | -0.386 |
| -0.223170000000119 | -0.386 |
| -0.220525000000119 | -0.386 |
| -0.217880000000119 | -0.387 |
| -0.215235000000119 | -0.387 |
| -0.212590000000119 | -0.387 |
| -0.209945000000119 | -0.388 |
| -0.207300000000119 | -0.388 |
| -0.204655000000119 | -0.388 |
| -0.202010000000119 | -0.389 |
| -0.199365000000119 | -0.389 |
| -0.196720000000119 | -0.389 |
| -0.194075000000119 | -0.389 |
| -0.191430000000119 | -0.39 |
| -0.188785000000119 | -0.39 |
| -0.186140000000119 | -0.39 |
| -0.183495000000119 | -0.391 |
| -0.180850000000119 | -0.391 |
| -0.178205000000119 | -0.391 |
| -0.175560000000118 | -0.391 |
| -0.172915000000118 | -0.392 |
| -0.170270000000118 | -0.392 |
| -0.167625000000118 | -0.392 |
| -0.164980000000118 | -0.392 |
| -0.162335000000118 | -0.393 |
| -0.159690000000118 | -0.393 |
| -0.157045000000118 | -0.393 |
| -0.154400000000118 | -0.393 |
| -0.151755000000118 | -0.393 |
| -0.149110000000118 | -0.394 |
| -0.146465000000118 | -0.394 |
| -0.143820000000118 | -0.394 |
| -0.141175000000118 | -0.394 |
| -0.138530000000118 | -0.395 |
| -0.135885000000118 | -0.395 |
| -0.133240000000118 | -0.395 |
| -0.130595000000118 | -0.395 |
| -0.127950000000118 | -0.395 |
| -0.125305000000118 | -0.395 |
| -0.122660000000118 | -0.396 |
| -0.120015000000118 | -0.396 |
| -0.117370000000118 | -0.396 |
| -0.114725000000118 | -0.396 |
| -0.112080000000118 | -0.396 |
| -0.109435000000118 | -0.397 |
| -0.106790000000118 | -0.397 |
| -0.104145000000118 | -0.397 |
| -0.101500000000118 | -0.397 |
| -0.0988550000001184 | -0.397 |
| -0.0962100000001184 | -0.397 |
| -0.0935650000001184 | -0.397 |
| -0.0909200000001184 | -0.398 |
| -0.0882750000001184 | -0.398 |
| -0.0856300000001184 | -0.398 |
| -0.0829850000001184 | -0.398 |
| -0.0803400000001184 | -0.398 |
| -0.0776950000001184 | -0.398 |
| -0.0750500000001184 | -0.398 |
| -0.0724050000001185 | -0.398 |
| -0.0697600000001184 | -0.399 |
| -0.0671150000001185 | -0.399 |
| -0.0644700000001185 | -0.399 |
| -0.0618250000001185 | -0.399 |
| -0.0591800000001185 | -0.399 |
| -0.0565350000001185 | -0.399 |
| -0.0538900000001185 | -0.399 |
| -0.0512450000001185 | -0.399 |
| -0.0486000000001185 | -0.399 |
| -0.0459550000001185 | -0.399 |
| -0.0433100000001185 | -0.399 |
| -0.0406650000001185 | -0.4 |
| -0.0380200000001185 | -0.4 |
| -0.0353750000001185 | -0.4 |
| -0.0327300000001184 | -0.4 |
| -0.0300850000001184 | -0.4 |
| -0.0274400000001184 | -0.4 |
| -0.0247950000001184 | -0.4 |
| -0.0221500000001184 | -0.4 |
| -0.0195050000001184 | -0.4 |
| -0.0168600000001184 | -0.4 |
| -0.0142150000001184 | -0.4 |
| -0.0115700000001184 | -0.4 |
| -0.00892500000011845 | -0.4 |
| -0.00628000000011845 | -0.4 |
| -0.00363500000011845 | -0.4 |
| -0.000990000000118447 | -0.4 |
| 0.00165499999988155 | -0.4 |
| 0.00429999999988155 | -0.4 |
| 0.00694499999988155 | -0.4 |
| 0.00958999999988155 | -0.4 |
| 0.0122349999998815 | -0.4 |
| 0.0148799999998815 | -0.4 |
| 0.0175249999998815 | -0.4 |
| 0.0201699999998815 | -0.4 |
| 0.0228149999998816 | -0.4 |
| 0.0254599999998816 | -0.4 |
| 0.0281049999998816 | -0.4 |
| 0.0307499999998816 | -0.4 |
| 0.0333949999998816 | -0.4 |
| 0.0360399999998816 | -0.4 |
| 0.0386849999998816 | -0.4 |
| 0.0413299999998816 | -0.399 |
| 0.0439749999998816 | -0.399 |
| 0.0466199999998816 | -0.399 |
| 0.0492649999998816 | -0.399 |
| 0.0519099999998816 | -0.399 |
| 0.0545549999998816 | -0.399 |
| 0.0571999999998816 | -0.399 |
| 0.0598449999998816 | -0.399 |
| 0.0624899999998816 | -0.399 |
| 0.0651349999998816 | -0.399 |
| 0.0677799999998816 | -0.399 |
| 0.0704249999998816 | -0.398 |
| 0.0730699999998816 | -0.398 |
| 0.0757149999998815 | -0.398 |
| 0.0783599999998815 | -0.398 |
| 0.0810049999998815 | -0.398 |
| 0.0836499999998815 | -0.398 |
| 0.0862949999998815 | -0.398 |
| 0.0889399999998815 | -0.398 |
| 0.0915849999998815 | -0.397 |
| 0.0942299999998815 | -0.397 |
| 0.0968749999998815 | -0.397 |
| 0.0995199999998815 | -0.397 |
| 0.102164999999881 | -0.397 |
| 0.104809999999881 | -0.397 |
| 0.107454999999881 | -0.396 |
| 0.110099999999881 | -0.396 |
| 0.112744999999881 | -0.396 |
| 0.115389999999881 | -0.396 |
| 0.118034999999881 | -0.396 |
| 0.120679999999881 | -0.395 |
| 0.123324999999881 | -0.395 |
| 0.125969999999881 | -0.395 |
| 0.128614999999881 | -0.395 |
| 0.131259999999881 | -0.395 |
| 0.133904999999881 | -0.394 |
| 0.136549999999881 | -0.394 |
| 0.139194999999881 | -0.394 |
| 0.141839999999881 | -0.394 |
| 0.144484999999881 | -0.393 |
| 0.147129999999882 | -0.393 |
| 0.149774999999882 | -0.393 |
| 0.152419999999882 | -0.393 |
| 0.155064999999882 | -0.392 |
| 0.157709999999882 | -0.392 |
| 0.160354999999882 | -0.392 |
| 0.162999999999882 | -0.392 |
| 0.165644999999882 | -0.391 |
| 0.168289999999882 | -0.391 |
| 0.170934999999882 | -0.391 |
| 0.173579999999882 | -0.39 |
| 0.176224999999882 | -0.39 |
| 0.178869999999882 | -0.39 |
| 0.181514999999882 | -0.39 |
| 0.184159999999882 | -0.389 |
| 0.186804999999882 | -0.389 |
| 0.189449999999882 | -0.389 |
| 0.192094999999882 | -0.388 |
| 0.194739999999882 | -0.388 |
| 0.197384999999882 | -0.388 |
| 0.200029999999882 | -0.387 |
| 0.202674999999882 | -0.387 |
| 0.205319999999882 | -0.386 |
| 0.207964999999882 | -0.386 |
| 0.210609999999882 | -0.386 |
| 0.213254999999882 | -0.385 |
| 0.215899999999882 | -0.385 |
| 0.218544999999882 | -0.385 |
| 0.221189999999882 | -0.384 |
| 0.223834999999882 | -0.384 |
| 0.226479999999882 | -0.383 |
| 0.229124999999882 | -0.383 |
| 0.231769999999882 | -0.383 |
| 0.234414999999882 | -0.382 |
| 0.237059999999882 | -0.382 |
| 0.239704999999882 | -0.381 |
| 0.242349999999882 | -0.381 |
| 0.244994999999882 | -0.381 |
| 0.247639999999882 | -0.38 |
| 0.250284999999882 | -0.38 |
| 0.252929999999882 | -0.379 |
| 0.255574999999882 | -0.379 |
| 0.258219999999882 | -0.378 |
| 0.260864999999882 | -0.378 |
| 0.263509999999882 | -0.377 |
| 0.266154999999882 | -0.377 |
| 0.268799999999882 | -0.376 |
| 0.271444999999882 | -0.376 |
| 0.274089999999882 | -0.375 |
| 0.276734999999882 | -0.375 |
| 0.279379999999882 | -0.374 |
| 0.282024999999882 | -0.374 |
| 0.284669999999882 | -0.373 |
| 0.287314999999882 | -0.373 |
| 0.289959999999882 | -0.372 |
| 0.292604999999882 | -0.372 |
| 0.295249999999882 | -0.371 |
| 0.297894999999882 | -0.371 |
| 0.300539999999882 | -0.37 |
| 0.303184999999882 | -0.37 |
| 0.305829999999882 | -0.369 |
| 0.308474999999882 | -0.369 |
| 0.311119999999882 | -0.368 |
| 0.313764999999882 | -0.367 |
| 0.316409999999882 | -0.367 |
| 0.319054999999882 | -0.366 |
| 0.321699999999882 | -0.366 |
| 0.324344999999882 | -0.365 |
| 0.326989999999882 | -0.364 |
| 0.329634999999882 | -0.364 |
| 0.332279999999882 | -0.363 |
| 0.334924999999882 | -0.363 |
| 0.337569999999882 | -0.362 |
| 0.340214999999882 | -0.361 |
| 0.342859999999882 | -0.361 |
| 0.345504999999882 | -0.36 |
| 0.348149999999882 | -0.359 |
| 0.350794999999882 | -0.359 |
| 0.353439999999882 | -0.358 |
| 0.356084999999882 | -0.357 |
| 0.358729999999882 | -0.357 |
| 0.361374999999882 | -0.356 |
| 0.364019999999882 | -0.355 |
| 0.366664999999882 | -0.355 |
| 0.369309999999882 | -0.354 |
| 0.371954999999882 | -0.353 |
| 0.374599999999882 | -0.353 |
| 0.377244999999882 | -0.352 |
| 0.379889999999882 | -0.351 |
| 0.382534999999882 | -0.351 |
| 0.385179999999882 | -0.35 |
| 0.387824999999882 | -0.349 |
| 0.390469999999882 | -0.348 |
| 0.393114999999882 | -0.348 |
| 0.395759999999882 | -0.347 |
| 0.398404999999882 | -0.346 |
| 0.401049999999882 | -0.345 |
| 0.403694999999882 | -0.345 |
| 0.406339999999882 | -0.344 |
| 0.408984999999882 | -0.343 |
| 0.411629999999882 | -0.342 |
| 0.414274999999882 | -0.341 |
| 0.416919999999882 | -0.341 |
| 0.419564999999882 | -0.34 |
| 0.422209999999882 | -0.339 |
| 0.424854999999882 | -0.338 |
| 0.427499999999882 | -0.337 |
| 0.430144999999882 | -0.337 |
| 0.432789999999882 | -0.336 |
| 0.435434999999882 | -0.335 |
| 0.438079999999882 | -0.334 |
| 0.440724999999882 | -0.333 |
| 0.443369999999882 | -0.332 |
| 0.446014999999882 | -0.331 |
| 0.448659999999882 | -0.331 |
| 0.451304999999882 | -0.33 |
| 0.453949999999882 | -0.329 |
| 0.456594999999882 | -0.328 |
| 0.459239999999882 | -0.327 |
| 0.461884999999882 | -0.326 |
| 0.464529999999883 | -0.325 |
| 0.467174999999883 | -0.324 |
| 0.469819999999883 | -0.323 |
| 0.472464999999883 | -0.322 |
| 0.475109999999883 | -0.322 |
| 0.477754999999883 | -0.321 |
| 0.480399999999883 | -0.32 |
| 0.483044999999883 | -0.319 |
| 0.485689999999883 | -0.318 |
| 0.488334999999883 | -0.317 |
| 0.490979999999883 | -0.316 |
| 0.493624999999883 | -0.315 |
| 0.496269999999883 | -0.314 |
| 0.498914999999883 | -0.313 |
| 0.501559999999883 | -0.312 |
| 0.504204999999883 | -0.311 |
| 0.506849999999883 | -0.31 |
| 0.509494999999883 | -0.309 |
| 0.512139999999883 | -0.308 |
| 0.514784999999883 | -0.307 |
| 0.517429999999883 | -0.306 |
| 0.520074999999883 | -0.305 |
| 0.522719999999883 | -0.304 |
| 0.525364999999883 | -0.303 |
| 0.528009999999883 | -0.302 |
| 0.530654999999883 | -0.301 |
| 0.533299999999883 | -0.3 |
| 0.535944999999883 | -0.298 |
| 0.538589999999883 | -0.297 |
| 0.541234999999883 | -0.296 |
| 0.543879999999883 | -0.295 |
| 0.546524999999883 | -0.294 |
| 0.549169999999883 | -0.293 |
| 0.551814999999883 | -0.292 |
| 0.554459999999883 | -0.291 |
| 0.557104999999883 | -0.29 |
| 0.559749999999883 | -0.288 |
| 0.562394999999883 | -0.287 |
| 0.565039999999883 | -0.286 |
| 0.567684999999883 | -0.285 |
| 0.570329999999883 | -0.284 |
| 0.572974999999883 | -0.283 |
| 0.575619999999883 | -0.282 |
| 0.578264999999883 | -0.28 |
| 0.580909999999883 | -0.279 |
| 0.583554999999883 | -0.278 |
| 0.586199999999883 | -0.277 |
| 0.588844999999883 | -0.276 |
| 0.591489999999883 | -0.274 |
| 0.594134999999883 | -0.273 |
| 0.596779999999883 | -0.272 |
| 0.599424999999883 | -0.271 |
| 0.602069999999883 | -0.269 |
| 0.604714999999883 | -0.268 |
| 0.607359999999883 | -0.267 |
| 0.610004999999883 | -0.266 |
| 0.612649999999883 | -0.264 |
| 0.615294999999883 | -0.263 |
| 0.617939999999883 | -0.262 |
| 0.620584999999883 | -0.261 |
| 0.623229999999883 | -0.259 |
| 0.625874999999883 | -0.258 |
| 0.628519999999883 | -0.257 |
| 0.631164999999883 | -0.255 |
| 0.633809999999883 | -0.254 |
| 0.636454999999883 | -0.253 |
| 0.639099999999883 | -0.251 |
| 0.641744999999883 | -0.25 |
| 0.644389999999883 | -0.249 |
| 0.647034999999883 | -0.247 |
| 0.649679999999883 | -0.246 |
| 0.652324999999883 | -0.245 |
| 0.654969999999883 | -0.243 |
| 0.657614999999883 | -0.242 |
| 0.660259999999883 | -0.24 |
| 0.662904999999883 | -0.239 |
| 0.665549999999883 | -0.238 |
| 0.668194999999883 | -0.236 |
| 0.670839999999883 | -0.235 |
| 0.673484999999883 | -0.233 |
| 0.676129999999883 | -0.232 |
| 0.678774999999883 | -0.231 |
| 0.681419999999883 | -0.229 |
| 0.684064999999883 | -0.228 |
| 0.686709999999883 | -0.226 |
| 0.689354999999883 | -0.225 |
| 0.691999999999883 | -0.223 |
| 0.694644999999883 | -0.222 |
| 0.697289999999883 | -0.22 |
| 0.699934999999883 | -0.219 |
| 0.702579999999883 | -0.217 |
| 0.705224999999883 | -0.216 |
| 0.707869999999883 | -0.214 |
| 0.710514999999883 | -0.213 |
| 0.713159999999883 | -0.211 |
| 0.715804999999883 | -0.21 |
| 0.718449999999883 | -0.208 |
| 0.721094999999883 | -0.207 |
| 0.723739999999883 | -0.205 |
| 0.726384999999883 | -0.203 |
| 0.729029999999883 | -0.202 |
| 0.731674999999883 | -0.2 |
| 0.734319999999883 | -0.199 |
| 0.736964999999883 | -0.197 |
| 0.739609999999883 | -0.195 |
| 0.742254999999883 | -0.194 |
| 0.744899999999883 | -0.192 |
| 0.747544999999883 | -0.191 |
| 0.750189999999883 | -0.189 |
| 0.752834999999883 | -0.187 |
| 0.755479999999883 | -0.186 |
| 0.758124999999883 | -0.184 |
| 0.760769999999883 | -0.182 |
| 0.763414999999883 | -0.181 |
| 0.766059999999883 | -0.179 |
| 0.768704999999883 | -0.177 |
| 0.771349999999883 | -0.176 |
| 0.773994999999883 | -0.174 |
| 0.776639999999883 | -0.172 |
| 0.779284999999883 | -0.17 |
| 0.781929999999883 | -0.169 |
| 0.784574999999883 | -0.167 |
| 0.787219999999883 | -0.165 |
| 0.789864999999883 | -0.164 |
| 0.792509999999883 | -0.162 |
| 0.795154999999884 | -0.16 |
| 0.797799999999884 | -0.158 |
| 0.800444999999884 | -0.157 |
| 0.803089999999884 | -0.155 |
| 0.805734999999884 | -0.153 |
| 0.808379999999884 | -0.151 |
| 0.811024999999884 | -0.149 |
| 0.813669999999884 | -0.148 |
| 0.816314999999884 | -0.146 |
| 0.818959999999884 | -0.144 |
| 0.821604999999884 | -0.142 |
| 0.824249999999884 | -0.14 |
| 0.826894999999884 | -0.138 |
| 0.829539999999884 | -0.136 |
| 0.832184999999884 | -0.135 |
| 0.834829999999884 | -0.133 |
| 0.837474999999884 | -0.131 |
| 0.840119999999884 | -0.129 |
| 0.842764999999884 | -0.127 |
| 0.845409999999884 | -0.125 |
| 0.848054999999884 | -0.123 |
| 0.850699999999884 | -0.121 |
| 0.853344999999884 | -0.119 |
| 0.855989999999884 | -0.117 |
| 0.858634999999884 | -0.116 |
| 0.861279999999884 | -0.114 |
| 0.863924999999884 | -0.112 |
| 0.866569999999884 | -0.11 |
| 0.869214999999884 | -0.108 |
| 0.871859999999884 | -0.106 |
| 0.874504999999884 | -0.104 |
| 0.877149999999884 | -0.102 |
| 0.879794999999884 | -0.1 |
| 0.882439999999884 | -0.098 |
| 0.885084999999884 | -0.096 |
| 0.887729999999884 | -0.094 |
| 0.890374999999884 | -0.092 |
| 0.893019999999884 | -0.09 |
| 0.895664999999884 | -0.087 |
| 0.898309999999884 | -0.085 |
| 0.900954999999884 | -0.083 |
| 0.903599999999884 | -0.081 |
| 0.906244999999884 | -0.079 |
| 0.908889999999884 | -0.077 |
| 0.911534999999884 | -0.075 |
| 0.914179999999884 | -0.073 |
| 0.916824999999884 | -0.071 |
| 0.919469999999884 | -0.069 |
| 0.922114999999884 | -0.067 |
| 0.924759999999884 | -0.064 |
| 0.927404999999884 | -0.062 |
| 0.930049999999884 | -0.06 |
| 0.932694999999884 | -0.058 |
| 0.935339999999884 | -0.056 |
| 0.937984999999884 | -0.054 |
| 0.940629999999884 | -0.051 |
| 0.943274999999884 | -0.049 |
| 0.945919999999884 | -0.047 |
| 0.948564999999884 | -0.045 |
| 0.951209999999884 | -0.042 |
| 0.953854999999884 | -0.04 |
| 0.956499999999884 | -0.038 |
| 0.959144999999884 | -0.036 |
| 0.961789999999884 | -0.034 |
| 0.964434999999884 | -0.031 |
| 0.967079999999884 | -0.029 |
| 0.969724999999884 | -0.027 |
| 0.972369999999884 | -0.024 |
| 0.975014999999884 | -0.022 |
| 0.977659999999884 | -0.02 |
| 0.980304999999884 | -0.017 |
| 0.982949999999884 | -0.015 |
| 0.985594999999884 | -0.013 |
| 0.988239999999884 | -0.011 |
| 0.990884999999884 | -0.008 |
| 0.993529999999884 | -0.006 |
| 0.996174999999884 | -0.003 |
| 0.998819999999884 | -0.001 |
| 1.001464999999884 | 0.001 |
| 1.004109999999884 | 0.004 |
| 1.006754999999884 | 0.006 |
| 1.009399999999884 | 0.009 |
| 1.012044999999884 | 0.011 |
| 1.014689999999884 | 0.013 |
| 1.017334999999884 | 0.016 |
| 1.019979999999884 | 0.018 |
| 1.022624999999884 | 0.021 |
| 1.025269999999884 | 0.023 |
| 1.027914999999884 | 0.026 |
| 1.030559999999884 | 0.028 |
| 1.033204999999884 | 0.031 |
| 1.035849999999884 | 0.033 |
| 1.038494999999884 | 0.036 |
| 1.041139999999884 | 0.038 |
| 1.043784999999884 | 0.041 |
| 1.046429999999884 | 0.043 |
| 1.049074999999884 | 0.046 |
| 1.051719999999884 | 0.048 |
| 1.054364999999884 | 0.051 |
| 1.057009999999884 | 0.053 |
| 1.059654999999884 | 0.056 |
| 1.062299999999884 | 0.058 |
| 1.064944999999884 | 0.061 |
| 1.067589999999884 | 0.064 |
| 1.070234999999884 | 0.066 |
| 1.072879999999884 | 0.069 |
| 1.075524999999884 | 0.071 |
| 1.078169999999884 | 0.074 |
| 1.080814999999884 | 0.077 |
| 1.083459999999884 | 0.079 |
| 1.086104999999884 | 0.082 |
| 1.088749999999884 | 0.085 |
| 1.091394999999884 | 0.087 |
| 1.094039999999884 | 0.09 |
| 1.096684999999884 | 0.093 |
| 1.099329999999884 | 0.095 |
| 1.101974999999884 | 0.098 |
| 1.104619999999884 | 0.101 |
| 1.107264999999884 | 0.104 |
| 1.109909999999884 | 0.106 |
| 1.112554999999884 | 0.109 |
| 1.115199999999884 | 0.112 |
| 1.117844999999885 | 0.115 |
| 1.120489999999885 | 0.117 |
| 1.123134999999885 | 0.12 |
| 1.125779999999885 | 0.123 |
| 1.128424999999885 | 0.126 |
| 1.131069999999885 | 0.128 |
| 1.133714999999885 | 0.131 |
| 1.136359999999885 | 0.134 |
| 1.139004999999885 | 0.137 |
| 1.141649999999885 | 0.14 |
| 1.144294999999885 | 0.143 |
| 1.146939999999885 | 0.146 |
| 1.149584999999885 | 0.148 |
| 1.152229999999885 | 0.151 |
| 1.154874999999885 | 0.154 |
| 1.157519999999885 | 0.157 |
| 1.160164999999885 | 0.16 |
| 1.162809999999885 | 0.163 |
| 1.165454999999885 | 0.166 |
| 1.168099999999885 | 0.169 |
| 1.170744999999885 | 0.172 |
| 1.173389999999885 | 0.175 |
| 1.176034999999885 | 0.178 |
| 1.178679999999885 | 0.181 |
| 1.181324999999885 | 0.184 |
| 1.183969999999885 | 0.187 |
| 1.186614999999885 | 0.189 |
| 1.189259999999885 | 0.193 |
| 1.191904999999885 | 0.196 |
| 1.194549999999885 | 0.199 |
| 1.197194999999885 | 0.202 |
| 1.199839999999885 | 0.205 |
| 1.202484999999885 | 0.208 |
| 1.205129999999885 | 0.211 |
| 1.207774999999885 | 0.214 |
| 1.210419999999885 | 0.217 |
| 1.213064999999885 | 0.22 |
| 1.215709999999885 | 0.223 |
| 1.218354999999885 | 0.226 |
| 1.220999999999885 | 0.229 |
| 1.223644999999885 | 0.232 |
| 1.226289999999885 | 0.236 |
| 1.228934999999885 | 0.239 |
| 1.231579999999885 | 0.242 |
| 1.234224999999885 | 0.245 |
| 1.236869999999885 | 0.248 |
| 1.239514999999885 | 0.251 |
| 1.242159999999885 | 0.255 |
| 1.244804999999885 | 0.258 |
| 1.247449999999885 | 0.261 |
| 1.250094999999885 | 0.264 |
| 1.252739999999885 | 0.267 |
| 1.255384999999885 | 0.271 |
| 1.258029999999885 | 0.274 |
| 1.260674999999885 | 0.277 |
| 1.263319999999885 | 0.28 |
| 1.265964999999885 | 0.284 |
| 1.268609999999885 | 0.287 |
| 1.271254999999885 | 0.29 |
| 1.273899999999885 | 0.294 |
| 1.276544999999885 | 0.297 |
| 1.279189999999885 | 0.3 |
| 1.281834999999885 | 0.304 |
| 1.284479999999885 | 0.307 |
| 1.287124999999885 | 0.31 |
| 1.289769999999885 | 0.314 |
| 1.292414999999885 | 0.317 |
| 1.295059999999885 | 0.32 |
| 1.297704999999885 | 0.324 |
| 1.300349999999885 | 0.327 |
| 1.302994999999885 | 0.331 |
| 1.305639999999885 | 0.334 |
| 1.308284999999885 | 0.337 |
| 1.310929999999885 | 0.341 |
| 1.313574999999885 | 0.344 |
| 1.316219999999885 | 0.348 |
| 1.318864999999885 | 0.351 |
| 1.321509999999885 | 0.355 |
| 1.324154999999885 | 0.358 |
| 1.326799999999885 | 0.362 |
| 1.329444999999885 | 0.365 |
| 1.332089999999885 | 0.369 |
| 1.334734999999885 | 0.372 |
| 1.337379999999885 | 0.376 |
| 1.340024999999885 | 0.379 |
| 1.342669999999885 | 0.383 |
| 1.345314999999885 | 0.386 |
| 1.347959999999885 | 0.39 |
| 1.350604999999885 | 0.394 |
| 1.353249999999885 | 0.397 |
| 1.355894999999885 | 0.401 |
| 1.358539999999885 | 0.404 |
| 1.361184999999885 | 0.408 |
| 1.363829999999885 | 0.412 |
| 1.366474999999885 | 0.415 |
| 1.369119999999885 | 0.419 |
| 1.371764999999885 | 0.423 |
| 1.374409999999885 | 0.426 |
| 1.377054999999885 | 0.43 |
| 1.379699999999885 | 0.434 |
| 1.382344999999885 | 0.437 |
| 1.384989999999885 | 0.441 |
| 1.387634999999885 | 0.445 |
| 1.390279999999885 | 0.449 |
| 1.392924999999885 | 0.452 |
| 1.395569999999885 | 0.456 |
| 1.398214999999885 | 0.46 |
| 1.400859999999885 | 0.464 |
| 1.403504999999885 | 0.467 |
| 1.406149999999885 | 0.471 |
| 1.408794999999885 | 0.475 |
| 1.411439999999885 | 0.479 |
| 1.414084999999885 | 0.483 |
| 1.416729999999885 | 0.486 |
| 1.419374999999885 | 0.49 |
| 1.422019999999885 | 0.494 |
| 1.424664999999885 | 0.498 |
| 1.427309999999885 | 0.502 |
| 1.429954999999885 | 0.506 |
| 1.432599999999885 | 0.51 |
| 1.435244999999885 | 0.514 |
| 1.437889999999886 | 0.518 |
| 1.440534999999886 | 0.521 |
| 1.443179999999886 | 0.525 |
| 1.445824999999886 | 0.529 |
| 1.448469999999886 | 0.533 |
| 1.451114999999886 | 0.537 |
| 1.453759999999886 | 0.541 |
| 1.456404999999886 | 0.545 |
| 1.459049999999886 | 0.549 |
| 1.461694999999886 | 0.553 |
| 1.464339999999886 | 0.557 |
| 1.466984999999886 | 0.561 |
| 1.469629999999886 | 0.565 |
| 1.472274999999886 | 0.569 |
| 1.474919999999886 | 0.573 |
| 1.477564999999886 | 0.578 |
| 1.480209999999886 | 0.582 |
| 1.482854999999886 | 0.586 |
| 1.485499999999886 | 0.59 |
| 1.488144999999886 | 0.594 |
| 1.490789999999886 | 0.598 |
| 1.493434999999886 | 0.602 |
| 1.496079999999886 | 0.606 |
| 1.498724999999886 | 0.61 |
| 1.501369999999886 | 0.615 |
| 1.504014999999886 | 0.619 |
| 1.506659999999886 | 0.623 |
| 1.509304999999886 | 0.627 |
| 1.511949999999886 | 0.631 |
| 1.514594999999886 | 0.636 |
| 1.517239999999886 | 0.64 |
| 1.519884999999886 | 0.644 |
| 1.522529999999886 | 0.648 |
| 1.525174999999886 | 0.653 |
| 1.527819999999886 | 0.657 |
| 1.530464999999886 | 0.661 |
| 1.533109999999886 | 0.665 |
| 1.535754999999886 | 0.67 |
| 1.538399999999886 | 0.674 |
| 1.541044999999886 | 0.678 |
| 1.543689999999886 | 0.683 |
| 1.546334999999886 | 0.687 |
| 1.548979999999886 | 0.691 |
| 1.551624999999886 | 0.696 |
| 1.554269999999886 | 0.7 |
| 1.556914999999886 | 0.705 |
| 1.559559999999886 | 0.709 |
| 1.562204999999886 | 0.713 |
| 1.564849999999886 | 0.718 |
| 1.567494999999886 | 0.722 |
| 1.570139999999886 | 0.727 |
| 1.572784999999886 | 0.731 |
| 1.575429999999886 | 0.736 |
| 1.578074999999886 | 0.74 |
| 1.580719999999886 | 0.745 |
| 1.583364999999886 | 0.749 |
| 1.586009999999886 | 0.754 |
| 1.588654999999886 | 0.758 |
| 1.591299999999886 | 0.763 |
| 1.593944999999886 | 0.767 |
| 1.596589999999886 | 0.772 |
| 1.599234999999886 | 0.776 |
| 1.601879999999886 | 0.781 |
| 1.604524999999886 | 0.785 |
| 1.607169999999886 | 0.79 |
| 1.609814999999886 | 0.795 |
| 1.612459999999886 | 0.799 |
| 1.615104999999886 | 0.804 |
| 1.617749999999886 | 0.809 |
| 1.620394999999886 | 0.813 |
| 1.623039999999886 | 0.818 |
| 1.625684999999886 | 0.822 |
| 1.628329999999886 | 0.827 |
| 1.630974999999886 | 0.832 |
| 1.633619999999886 | 0.837 |
| 1.636264999999886 | 0.841 |
| 1.638909999999886 | 0.846 |
| 1.641554999999886 | 0.851 |
| 1.644199999999886 | 0.856 |
| 1.646844999999886 | 0.86 |
| 1.649489999999886 | 0.865 |
| 1.652134999999886 | 0.87 |
| 1.654779999999886 | 0.875 |
| 1.657424999999886 | 0.879 |
| 1.660069999999886 | 0.884 |
| 1.662714999999886 | 0.889 |
| 1.665359999999886 | 0.894 |
| 1.668004999999886 | 0.899 |
| 1.670649999999886 | 0.904 |
| 1.673294999999886 | 0.908 |
| 1.675939999999886 | 0.913 |
| 1.678584999999886 | 0.918 |
| 1.681229999999886 | 0.923 |
| 1.683874999999886 | 0.928 |
| 1.686519999999886 | 0.933 |
| 1.689164999999886 | 0.938 |
| 1.691809999999886 | 0.943 |
| 1.694454999999886 | 0.948 |
| 1.697099999999886 | 0.953 |
| 1.699744999999886 | 0.958 |
| 1.702389999999886 | 0.963 |
| 1.705034999999886 | 0.968 |
| 1.707679999999886 | 0.973 |
| 1.710324999999886 | 0.978 |
| 1.712969999999886 | 0.983 |
| 1.715614999999886 | 0.988 |
| 1.718259999999886 | 0.993 |
| 1.720904999999886 | 0.998 |
| 1.723549999999886 | 1.003 |
| 1.726194999999886 | 1.008 |
| 1.728839999999886 | 1.013 |
| 1.731484999999886 | 1.019 |
| 1.734129999999886 | 1.024 |
| 1.736774999999886 | 1.029 |
| 1.739419999999886 | 1.034 |
| 1.742064999999886 | 1.039 |
| 1.744709999999886 | 1.044 |
| 1.747354999999886 | 1.049 |
| 1.749999999999886 | 1.055 |